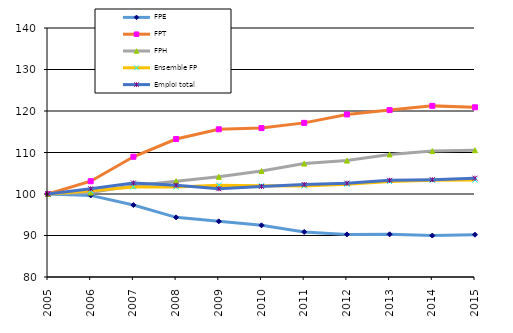
| Category | FPE | FPT | FPH | Ensemble FP | Emploi total |
|---|---|---|---|---|---|
| 2005.0 | 100 | 100 | 100 | 100 | 100 |
| 2006.0 | 99.661 | 103.079 | 100.336 | 100.808 | 101.266 |
| 2007.0 | 97.332 | 108.975 | 101.991 | 101.712 | 102.661 |
| 2008.0 | 94.372 | 113.248 | 103.093 | 101.706 | 102.102 |
| 2009.0 | 93.412 | 115.593 | 104.135 | 102.124 | 101.262 |
| 2010.0 | 92.448 | 115.883 | 105.537 | 102.004 | 101.832 |
| 2011.0 | 90.861 | 117.14 | 107.332 | 101.934 | 102.283 |
| 2012.0 | 90.258 | 119.172 | 108.05 | 102.376 | 102.603 |
| 2013.0 | 90.286 | 120.217 | 109.543 | 102.997 | 103.303 |
| 2014.0 | 89.984 | 121.235 | 110.34 | 103.306 | 103.447 |
| 2015.0 | 90.189 | 120.893 | 110.548 | 103.349 | 103.81 |